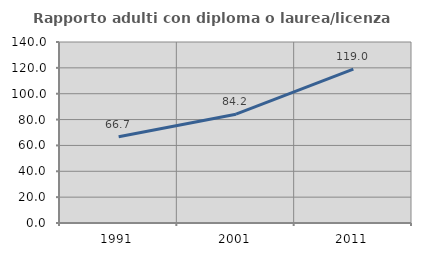
| Category | Rapporto adulti con diploma o laurea/licenza media  |
|---|---|
| 1991.0 | 66.741 |
| 2001.0 | 84.181 |
| 2011.0 | 118.955 |